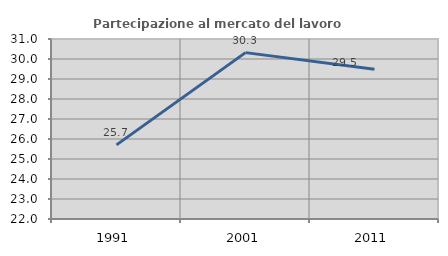
| Category | Partecipazione al mercato del lavoro  femminile |
|---|---|
| 1991.0 | 25.706 |
| 2001.0 | 30.318 |
| 2011.0 | 29.485 |